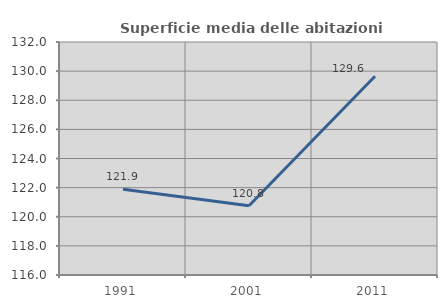
| Category | Superficie media delle abitazioni occupate |
|---|---|
| 1991.0 | 121.894 |
| 2001.0 | 120.753 |
| 2011.0 | 129.648 |